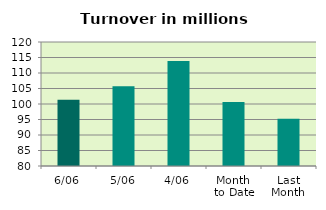
| Category | Series 0 |
|---|---|
| 6/06 | 101.407 |
| 5/06 | 105.728 |
| 4/06 | 113.89 |
| Month 
to Date | 100.655 |
| Last
Month | 95.269 |